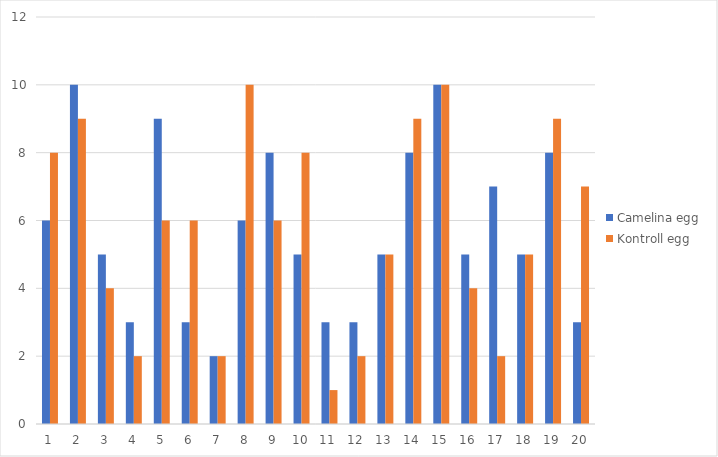
| Category | Camelina egg | Kontroll egg |
|---|---|---|
| 1.0 | 6 | 8 |
| 2.0 | 10 | 9 |
| 3.0 | 5 | 4 |
| 4.0 | 3 | 2 |
| 5.0 | 9 | 6 |
| 6.0 | 3 | 6 |
| 7.0 | 2 | 2 |
| 8.0 | 6 | 10 |
| 9.0 | 8 | 6 |
| 10.0 | 5 | 8 |
| 11.0 | 3 | 1 |
| 12.0 | 3 | 2 |
| 13.0 | 5 | 5 |
| 14.0 | 8 | 9 |
| 15.0 | 10 | 10 |
| 16.0 | 5 | 4 |
| 17.0 | 7 | 2 |
| 18.0 | 5 | 5 |
| 19.0 | 8 | 9 |
| 20.0 | 3 | 7 |